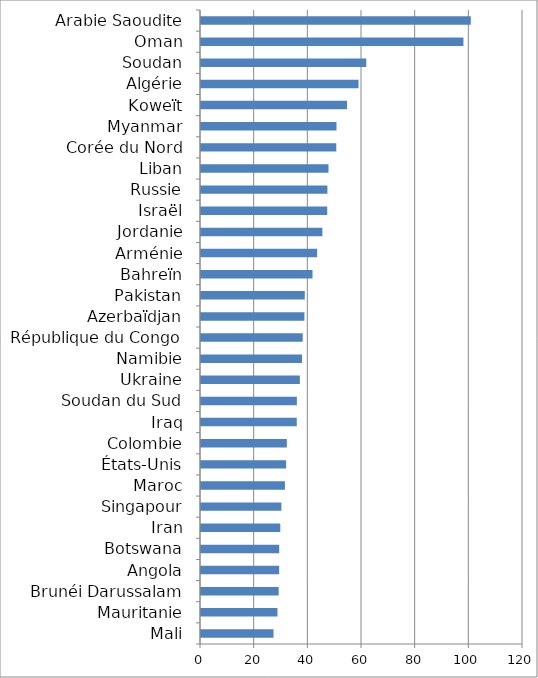
| Category | Series 0 |
|---|---|
| Mali | 27.029 |
| Mauritanie | 28.493 |
| Brunéi Darussalam | 28.952 |
| Angola | 29.125 |
| Botswana | 29.14 |
| Iran | 29.553 |
| Singapour | 29.96 |
| Maroc | 31.284 |
| États-Unis | 31.73 |
| Colombie | 31.992 |
| Iraq | 35.688 |
| Soudan du Sud | 35.724 |
| Ukraine | 36.841 |
| Namibie | 37.655 |
| République du Congo | 37.907 |
| Azerbaïdjan | 38.537 |
| Pakistan | 38.681 |
| Bahreïn | 41.556 |
| Arménie | 43.3 |
| Jordanie | 45.231 |
| Israël | 47.046 |
| Russie | 47.109 |
| Liban | 47.524 |
| Corée du Nord | 50.416 |
| Myanmar | 50.481 |
| Koweït | 54.43 |
| Algérie | 58.707 |
| Soudan | 61.589 |
| Oman | 97.799 |
| Arabie Saoudite | 100.543 |